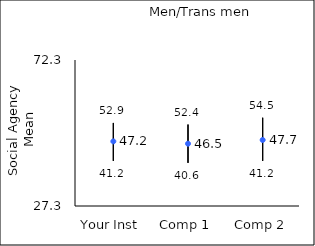
| Category | 25th percentile | 75th percentile | Mean |
|---|---|---|---|
| Your Inst | 41.2 | 52.9 | 47.22 |
| Comp 1 | 40.6 | 52.4 | 46.5 |
| Comp 2 | 41.2 | 54.5 | 47.65 |